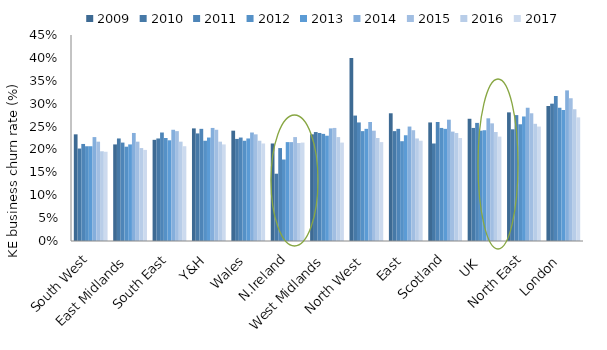
| Category | 2009 | 2010 | 2011 | 2012 | 2013 | 2014 | 2015 | 2016 | 2017 |
|---|---|---|---|---|---|---|---|---|---|
| South West | 0.233 | 0.202 | 0.212 | 0.207 | 0.207 | 0.227 | 0.217 | 0.196 | 0.195 |
| East Midlands | 0.211 | 0.224 | 0.215 | 0.206 | 0.211 | 0.236 | 0.217 | 0.203 | 0.199 |
| South East | 0.221 | 0.224 | 0.237 | 0.225 | 0.22 | 0.243 | 0.24 | 0.217 | 0.207 |
| Y&H | 0.246 | 0.235 | 0.245 | 0.219 | 0.226 | 0.247 | 0.243 | 0.217 | 0.211 |
| Wales | 0.241 | 0.223 | 0.226 | 0.219 | 0.224 | 0.237 | 0.233 | 0.219 | 0.213 |
| N.Ireland | 0.213 | 0.147 | 0.203 | 0.178 | 0.216 | 0.216 | 0.227 | 0.214 | 0.215 |
| West Midlands | 0.233 | 0.238 | 0.236 | 0.234 | 0.23 | 0.246 | 0.247 | 0.227 | 0.215 |
| North West | 0.4 | 0.274 | 0.259 | 0.24 | 0.245 | 0.26 | 0.241 | 0.225 | 0.216 |
| East | 0.279 | 0.24 | 0.245 | 0.218 | 0.231 | 0.25 | 0.242 | 0.224 | 0.219 |
| Scotland | 0.259 | 0.213 | 0.26 | 0.247 | 0.245 | 0.265 | 0.239 | 0.236 | 0.225 |
| UK  | 0.267 | 0.247 | 0.258 | 0.241 | 0.242 | 0.268 | 0.257 | 0.238 | 0.228 |
| North East | 0.281 | 0.244 | 0.275 | 0.255 | 0.272 | 0.291 | 0.279 | 0.256 | 0.25 |
| London | 0.295 | 0.3 | 0.317 | 0.291 | 0.286 | 0.329 | 0.312 | 0.288 | 0.27 |